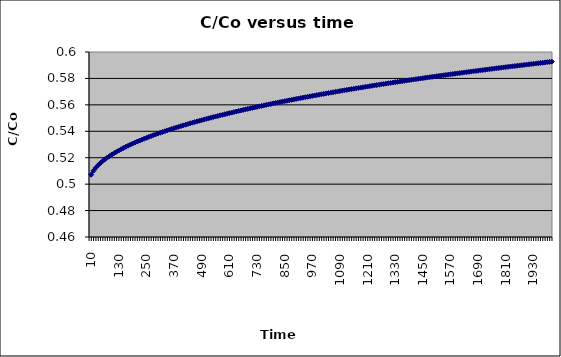
| Category | Series 0 |
|---|---|
| 10.0 | 0.507 |
| 20.0 | 0.51 |
| 30.0 | 0.512 |
| 40.0 | 0.514 |
| 50.0 | 0.516 |
| 60.0 | 0.517 |
| 70.0 | 0.519 |
| 80.0 | 0.52 |
| 90.0 | 0.521 |
| 100.0 | 0.522 |
| 110.0 | 0.523 |
| 120.0 | 0.525 |
| 130.0 | 0.525 |
| 140.0 | 0.526 |
| 150.0 | 0.527 |
| 160.0 | 0.528 |
| 170.0 | 0.529 |
| 180.0 | 0.53 |
| 190.0 | 0.531 |
| 200.0 | 0.531 |
| 210.0 | 0.532 |
| 220.0 | 0.533 |
| 230.0 | 0.534 |
| 240.0 | 0.534 |
| 250.0 | 0.535 |
| 260.0 | 0.536 |
| 270.0 | 0.536 |
| 280.0 | 0.537 |
| 290.0 | 0.538 |
| 300.0 | 0.538 |
| 310.0 | 0.539 |
| 320.0 | 0.539 |
| 330.0 | 0.54 |
| 340.0 | 0.541 |
| 350.0 | 0.541 |
| 360.0 | 0.542 |
| 370.0 | 0.542 |
| 380.0 | 0.543 |
| 390.0 | 0.543 |
| 400.0 | 0.544 |
| 410.0 | 0.544 |
| 420.0 | 0.545 |
| 430.0 | 0.545 |
| 440.0 | 0.546 |
| 450.0 | 0.546 |
| 460.0 | 0.547 |
| 470.0 | 0.547 |
| 480.0 | 0.548 |
| 490.0 | 0.548 |
| 500.0 | 0.549 |
| 510.0 | 0.549 |
| 520.0 | 0.55 |
| 530.0 | 0.55 |
| 540.0 | 0.551 |
| 550.0 | 0.551 |
| 560.0 | 0.552 |
| 570.0 | 0.552 |
| 580.0 | 0.552 |
| 590.0 | 0.553 |
| 600.0 | 0.553 |
| 610.0 | 0.554 |
| 620.0 | 0.554 |
| 630.0 | 0.555 |
| 640.0 | 0.555 |
| 650.0 | 0.555 |
| 660.0 | 0.556 |
| 670.0 | 0.556 |
| 680.0 | 0.557 |
| 690.0 | 0.557 |
| 700.0 | 0.557 |
| 710.0 | 0.558 |
| 720.0 | 0.558 |
| 730.0 | 0.558 |
| 740.0 | 0.559 |
| 750.0 | 0.559 |
| 760.0 | 0.56 |
| 770.0 | 0.56 |
| 780.0 | 0.56 |
| 790.0 | 0.561 |
| 800.0 | 0.561 |
| 810.0 | 0.561 |
| 820.0 | 0.562 |
| 830.0 | 0.562 |
| 840.0 | 0.562 |
| 850.0 | 0.563 |
| 860.0 | 0.563 |
| 870.0 | 0.563 |
| 880.0 | 0.564 |
| 890.0 | 0.564 |
| 900.0 | 0.564 |
| 910.0 | 0.565 |
| 920.0 | 0.565 |
| 930.0 | 0.565 |
| 940.0 | 0.566 |
| 950.0 | 0.566 |
| 960.0 | 0.566 |
| 970.0 | 0.567 |
| 980.0 | 0.567 |
| 990.0 | 0.567 |
| 1000.0 | 0.568 |
| 1010.0 | 0.568 |
| 1020.0 | 0.568 |
| 1030.0 | 0.569 |
| 1040.0 | 0.569 |
| 1050.0 | 0.569 |
| 1060.0 | 0.57 |
| 1070.0 | 0.57 |
| 1080.0 | 0.57 |
| 1090.0 | 0.57 |
| 1100.0 | 0.571 |
| 1110.0 | 0.571 |
| 1120.0 | 0.571 |
| 1130.0 | 0.572 |
| 1140.0 | 0.572 |
| 1150.0 | 0.572 |
| 1160.0 | 0.572 |
| 1170.0 | 0.573 |
| 1180.0 | 0.573 |
| 1190.0 | 0.573 |
| 1200.0 | 0.574 |
| 1210.0 | 0.574 |
| 1220.0 | 0.574 |
| 1230.0 | 0.574 |
| 1240.0 | 0.575 |
| 1250.0 | 0.575 |
| 1260.0 | 0.575 |
| 1270.0 | 0.576 |
| 1280.0 | 0.576 |
| 1290.0 | 0.576 |
| 1300.0 | 0.576 |
| 1310.0 | 0.577 |
| 1320.0 | 0.577 |
| 1330.0 | 0.577 |
| 1340.0 | 0.577 |
| 1350.0 | 0.578 |
| 1360.0 | 0.578 |
| 1370.0 | 0.578 |
| 1380.0 | 0.578 |
| 1390.0 | 0.579 |
| 1400.0 | 0.579 |
| 1410.0 | 0.579 |
| 1420.0 | 0.579 |
| 1430.0 | 0.58 |
| 1440.0 | 0.58 |
| 1450.0 | 0.58 |
| 1460.0 | 0.58 |
| 1470.0 | 0.581 |
| 1480.0 | 0.581 |
| 1490.0 | 0.581 |
| 1500.0 | 0.581 |
| 1510.0 | 0.582 |
| 1520.0 | 0.582 |
| 1530.0 | 0.582 |
| 1540.0 | 0.582 |
| 1550.0 | 0.583 |
| 1560.0 | 0.583 |
| 1570.0 | 0.583 |
| 1580.0 | 0.583 |
| 1590.0 | 0.584 |
| 1600.0 | 0.584 |
| 1610.0 | 0.584 |
| 1620.0 | 0.584 |
| 1630.0 | 0.585 |
| 1640.0 | 0.585 |
| 1650.0 | 0.585 |
| 1660.0 | 0.585 |
| 1670.0 | 0.585 |
| 1680.0 | 0.586 |
| 1690.0 | 0.586 |
| 1700.0 | 0.586 |
| 1710.0 | 0.586 |
| 1720.0 | 0.587 |
| 1730.0 | 0.587 |
| 1740.0 | 0.587 |
| 1750.0 | 0.587 |
| 1760.0 | 0.587 |
| 1770.0 | 0.588 |
| 1780.0 | 0.588 |
| 1790.0 | 0.588 |
| 1800.0 | 0.588 |
| 1810.0 | 0.589 |
| 1820.0 | 0.589 |
| 1830.0 | 0.589 |
| 1840.0 | 0.589 |
| 1850.0 | 0.589 |
| 1860.0 | 0.59 |
| 1870.0 | 0.59 |
| 1880.0 | 0.59 |
| 1890.0 | 0.59 |
| 1900.0 | 0.59 |
| 1910.0 | 0.591 |
| 1920.0 | 0.591 |
| 1930.0 | 0.591 |
| 1940.0 | 0.591 |
| 1950.0 | 0.591 |
| 1960.0 | 0.592 |
| 1970.0 | 0.592 |
| 1980.0 | 0.592 |
| 1990.0 | 0.592 |
| 2000.0 | 0.593 |
| 2010.0 | 0.593 |